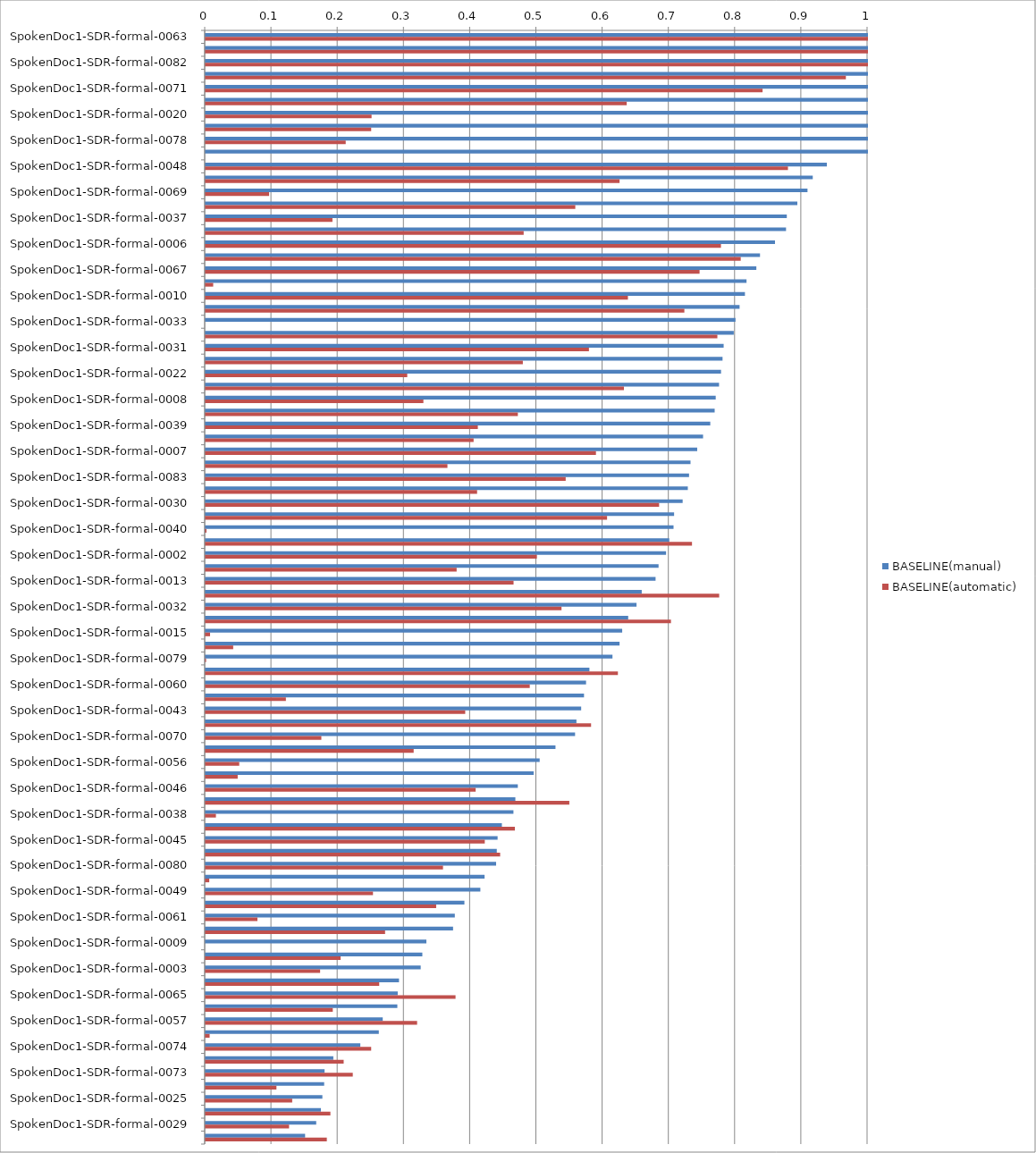
| Category | BASELINE(manual) | BASELINE(automatic) |
|---|---|---|
| SpokenDoc1-SDR-formal-0063 | 1 | 1 |
| SpokenDoc1-SDR-formal-0076 | 1 | 1 |
| SpokenDoc1-SDR-formal-0082 | 1 | 1 |
| SpokenDoc1-SDR-formal-0044 | 1 | 0.967 |
| SpokenDoc1-SDR-formal-0071 | 1 | 0.841 |
| SpokenDoc1-SDR-formal-0036 | 1 | 0.636 |
| SpokenDoc1-SDR-formal-0020 | 1 | 0.251 |
| SpokenDoc1-SDR-formal-0019 | 1 | 0.25 |
| SpokenDoc1-SDR-formal-0078 | 1 | 0.212 |
| SpokenDoc1-SDR-formal-0021 | 1 | 0 |
| SpokenDoc1-SDR-formal-0048 | 0.938 | 0.879 |
| SpokenDoc1-SDR-formal-0001 | 0.917 | 0.625 |
| SpokenDoc1-SDR-formal-0069 | 0.909 | 0.096 |
| SpokenDoc1-SDR-formal-0023 | 0.893 | 0.558 |
| SpokenDoc1-SDR-formal-0037 | 0.877 | 0.192 |
| SpokenDoc1-SDR-formal-0041 | 0.876 | 0.48 |
| SpokenDoc1-SDR-formal-0006 | 0.86 | 0.778 |
| SpokenDoc1-SDR-formal-0035 | 0.837 | 0.808 |
| SpokenDoc1-SDR-formal-0067 | 0.831 | 0.746 |
| SpokenDoc1-SDR-formal-0004 | 0.817 | 0.011 |
| SpokenDoc1-SDR-formal-0010 | 0.814 | 0.638 |
| SpokenDoc1-SDR-formal-0053 | 0.806 | 0.723 |
| SpokenDoc1-SDR-formal-0033 | 0.8 | 0 |
| SpokenDoc1-SDR-formal-0075 | 0.797 | 0.773 |
| SpokenDoc1-SDR-formal-0031 | 0.782 | 0.579 |
| SpokenDoc1-SDR-formal-0054 | 0.78 | 0.479 |
| SpokenDoc1-SDR-formal-0022 | 0.778 | 0.304 |
| SpokenDoc1-SDR-formal-0086 | 0.775 | 0.632 |
| SpokenDoc1-SDR-formal-0008 | 0.77 | 0.329 |
| SpokenDoc1-SDR-formal-0072 | 0.769 | 0.471 |
| SpokenDoc1-SDR-formal-0039 | 0.762 | 0.411 |
| SpokenDoc1-SDR-formal-0077 | 0.751 | 0.405 |
| SpokenDoc1-SDR-formal-0007 | 0.742 | 0.589 |
| SpokenDoc1-SDR-formal-0011 | 0.732 | 0.365 |
| SpokenDoc1-SDR-formal-0083 | 0.73 | 0.544 |
| SpokenDoc1-SDR-formal-0066 | 0.728 | 0.41 |
| SpokenDoc1-SDR-formal-0030 | 0.72 | 0.685 |
| SpokenDoc1-SDR-formal-0055 | 0.707 | 0.606 |
| SpokenDoc1-SDR-formal-0040 | 0.706 | 0.001 |
| SpokenDoc1-SDR-formal-0062 | 0.7 | 0.734 |
| SpokenDoc1-SDR-formal-0002 | 0.695 | 0.5 |
| SpokenDoc1-SDR-formal-0026 | 0.684 | 0.379 |
| SpokenDoc1-SDR-formal-0013 | 0.679 | 0.465 |
| SpokenDoc1-SDR-formal-0028 | 0.658 | 0.775 |
| SpokenDoc1-SDR-formal-0032 | 0.651 | 0.537 |
| SpokenDoc1-SDR-formal-0034 | 0.638 | 0.703 |
| SpokenDoc1-SDR-formal-0015 | 0.629 | 0.007 |
| SpokenDoc1-SDR-formal-0005 | 0.625 | 0.042 |
| SpokenDoc1-SDR-formal-0079 | 0.614 | 0.001 |
| SpokenDoc1-SDR-formal-0042 | 0.579 | 0.622 |
| SpokenDoc1-SDR-formal-0060 | 0.574 | 0.489 |
| SpokenDoc1-SDR-formal-0084 | 0.571 | 0.121 |
| SpokenDoc1-SDR-formal-0043 | 0.567 | 0.392 |
| SpokenDoc1-SDR-formal-0047 | 0.56 | 0.582 |
| SpokenDoc1-SDR-formal-0070 | 0.558 | 0.175 |
| SpokenDoc1-SDR-formal-0018 | 0.528 | 0.314 |
| SpokenDoc1-SDR-formal-0056 | 0.504 | 0.051 |
| SpokenDoc1-SDR-formal-0017 | 0.495 | 0.048 |
| SpokenDoc1-SDR-formal-0046 | 0.471 | 0.408 |
| SpokenDoc1-SDR-formal-0058 | 0.468 | 0.549 |
| SpokenDoc1-SDR-formal-0038 | 0.465 | 0.016 |
| SpokenDoc1-SDR-formal-0064 | 0.447 | 0.467 |
| SpokenDoc1-SDR-formal-0045 | 0.441 | 0.422 |
| SpokenDoc1-SDR-formal-0059 | 0.44 | 0.445 |
| SpokenDoc1-SDR-formal-0080 | 0.439 | 0.358 |
| SpokenDoc1-SDR-formal-0024 | 0.421 | 0.006 |
| SpokenDoc1-SDR-formal-0049 | 0.415 | 0.253 |
| SpokenDoc1-SDR-formal-0051 | 0.391 | 0.348 |
| SpokenDoc1-SDR-formal-0061 | 0.376 | 0.078 |
| SpokenDoc1-SDR-formal-0014 | 0.374 | 0.271 |
| SpokenDoc1-SDR-formal-0009 | 0.333 | 0 |
| SpokenDoc1-SDR-formal-0050 | 0.327 | 0.204 |
| SpokenDoc1-SDR-formal-0003 | 0.325 | 0.173 |
| SpokenDoc1-SDR-formal-0016 | 0.292 | 0.262 |
| SpokenDoc1-SDR-formal-0065 | 0.29 | 0.377 |
| SpokenDoc1-SDR-formal-0081 | 0.289 | 0.192 |
| SpokenDoc1-SDR-formal-0057 | 0.267 | 0.319 |
| SpokenDoc1-SDR-formal-0027 | 0.262 | 0.006 |
| SpokenDoc1-SDR-formal-0074 | 0.234 | 0.25 |
| SpokenDoc1-SDR-formal-0052 | 0.193 | 0.208 |
| SpokenDoc1-SDR-formal-0073 | 0.18 | 0.222 |
| SpokenDoc1-SDR-formal-0085 | 0.179 | 0.107 |
| SpokenDoc1-SDR-formal-0025 | 0.176 | 0.131 |
| SpokenDoc1-SDR-formal-0068 | 0.174 | 0.188 |
| SpokenDoc1-SDR-formal-0029 | 0.167 | 0.126 |
| SpokenDoc1-SDR-formal-0012 | 0.15 | 0.183 |